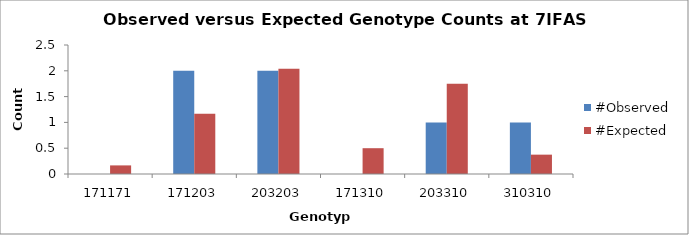
| Category | #Observed | #Expected |
|---|---|---|
| 171171.0 | 0 | 0.167 |
| 171203.0 | 2 | 1.167 |
| 203203.0 | 2 | 2.042 |
| 171310.0 | 0 | 0.5 |
| 203310.0 | 1 | 1.75 |
| 310310.0 | 1 | 0.375 |